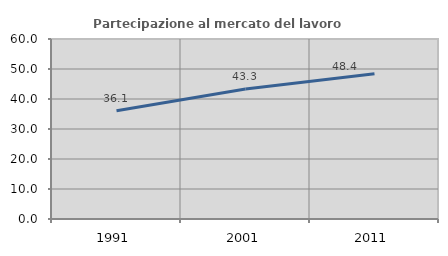
| Category | Partecipazione al mercato del lavoro  femminile |
|---|---|
| 1991.0 | 36.092 |
| 2001.0 | 43.33 |
| 2011.0 | 48.425 |